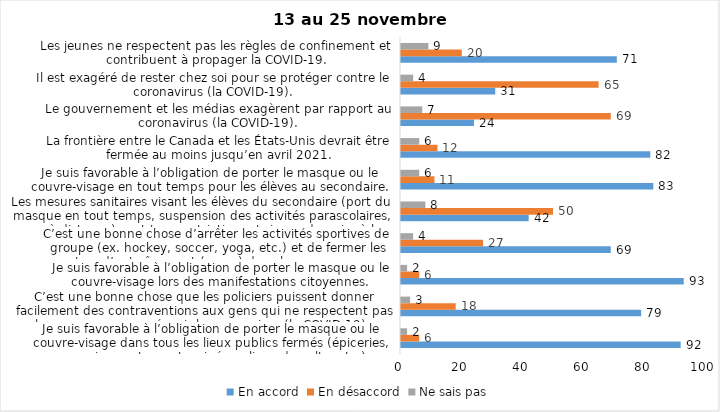
| Category | En accord | En désaccord | Ne sais pas |
|---|---|---|---|
| Je suis favorable à l’obligation de porter le masque ou le couvre-visage dans tous les lieux publics fermés (épiceries, magasins, restaurants, cinéma, lieux de culte, etc.). | 92 | 6 | 2 |
| C’est une bonne chose que les policiers puissent donner facilement des contraventions aux gens qui ne respectent pas les mesures pour prévenir le coronavirus (la COVID-19). | 79 | 18 | 3 |
| Je suis favorable à l’obligation de porter le masque ou le couvre-visage lors des manifestations citoyennes. | 93 | 6 | 2 |
| C’est une bonne chose d’arrêter les activités sportives de groupe (ex. hockey, soccer, yoga, etc.) et de fermer les centres d’entraînement (gyms) dans les zones rouges. | 69 | 27 | 4 |
| Les mesures sanitaires visant les élèves du secondaire (port du masque en tout temps, suspension des activités parascolaires, cours à distance) sont trop restrictives et risque de nuire à leur santé mentale et leur développement. | 42 | 50 | 8 |
| Je suis favorable à l’obligation de porter le masque ou le couvre-visage en tout temps pour les élèves au secondaire. | 83 | 11 | 6 |
| La frontière entre le Canada et les États-Unis devrait être fermée au moins jusqu’en avril 2021. | 82 | 12 | 6 |
| Le gouvernement et les médias exagèrent par rapport au coronavirus (la COVID-19). | 24 | 69 | 7 |
| Il est exagéré de rester chez soi pour se protéger contre le coronavirus (la COVID-19). | 31 | 65 | 4 |
| Les jeunes ne respectent pas les règles de confinement et contribuent à propager la COVID-19. | 71 | 20 | 9 |